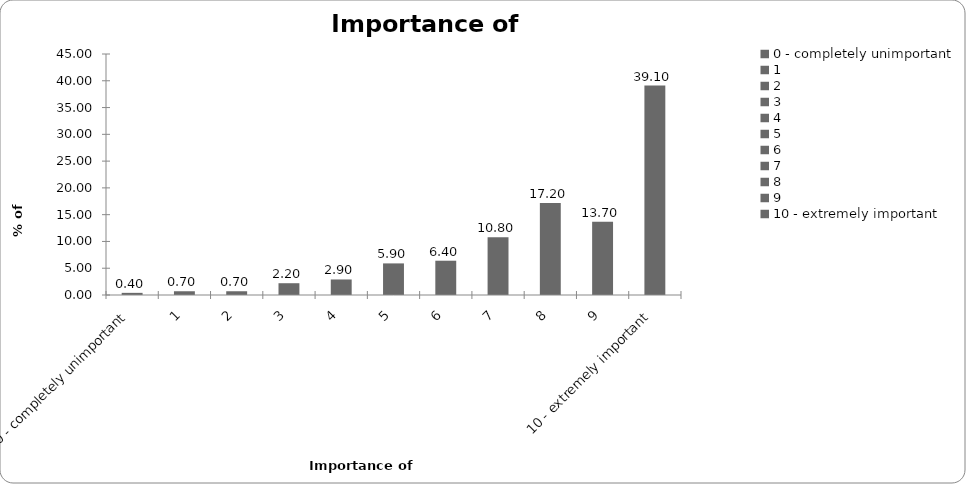
| Category | Importance of insurance |
|---|---|
| 0 - completely unimportant | 0.4 |
| 1 | 0.7 |
| 2 | 0.7 |
| 3 | 2.2 |
| 4 | 2.9 |
| 5 | 5.9 |
| 6 | 6.4 |
| 7 | 10.8 |
| 8 | 17.2 |
| 9 | 13.7 |
| 10 - extremely important | 39.1 |